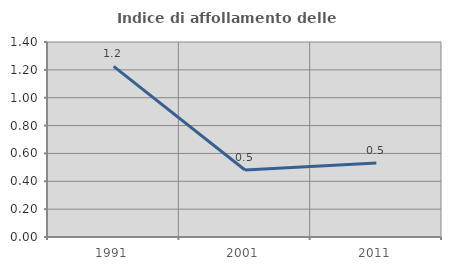
| Category | Indice di affollamento delle abitazioni  |
|---|---|
| 1991.0 | 1.225 |
| 2001.0 | 0.481 |
| 2011.0 | 0.532 |